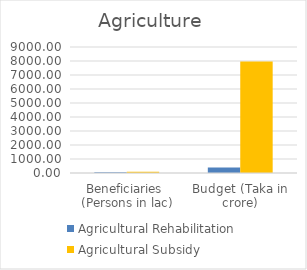
| Category | Agricultural Rehabilitation | Agricultural Subsidy |
|---|---|---|
| Beneficiaries  (Persons in lac) | 60 | 87 |
| Budget (Taka in crore) | 400 | 7970 |